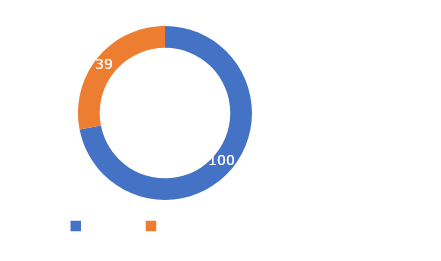
| Category | Series 0 |
|---|---|
| META  | 100 |
| CUMPLIMIENTO | 39 |